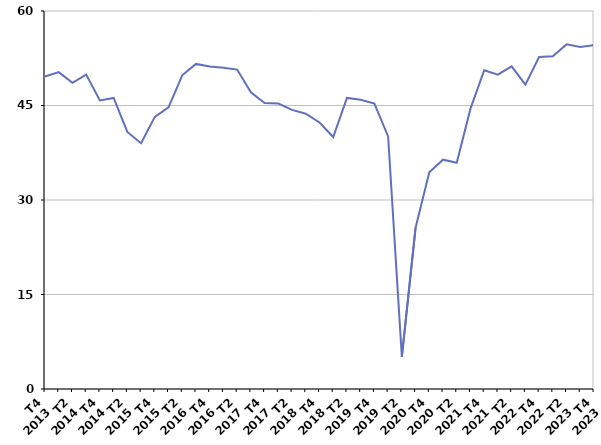
| Category | Radiation administrative |
|---|---|
| T4
2013 | 49.6 |
| T1
2014 | 50.3 |
| T2
2014 | 48.6 |
| T3
2014 | 49.9 |
| T4
2014 | 45.8 |
| T1
2015 | 46.2 |
| T2
2015 | 40.8 |
| T3
2015 | 39 |
| T4
2015 | 43.2 |
| T1
2016 | 44.7 |
| T2
2016 | 49.8 |
| T3
2016 | 51.6 |
| T4
2016 | 51.2 |
| T1
2017 | 51 |
| T2
2017 | 50.7 |
| T3
2017 | 47.1 |
| T4
2017 | 45.4 |
| T1
2018 | 45.3 |
| T2
2018 | 44.3 |
| T3
2018 | 43.7 |
| T4
2018 | 42.3 |
| T1
2019 | 40 |
| T2
2019 | 46.2 |
| T3
2019 | 45.9 |
| T4
2019 | 45.3 |
| T1
2020 | 40.1 |
| T2
2020 | 5.1 |
| T3
2020 | 25.6 |
| T4
2020 | 34.4 |
| T1
2021 | 36.4 |
| T2
2021 | 35.9 |
| T3
2021 | 44.5 |
| T4
2021 | 50.6 |
| T1
2022 | 49.9 |
| T2
2022 | 51.2 |
| T3
2022 | 48.3 |
| T4
2022 | 52.7 |
| T1
2023 | 52.8 |
| T2
2023 | 54.7 |
| T3
2023 | 54.3 |
| T4
2023 | 54.6 |